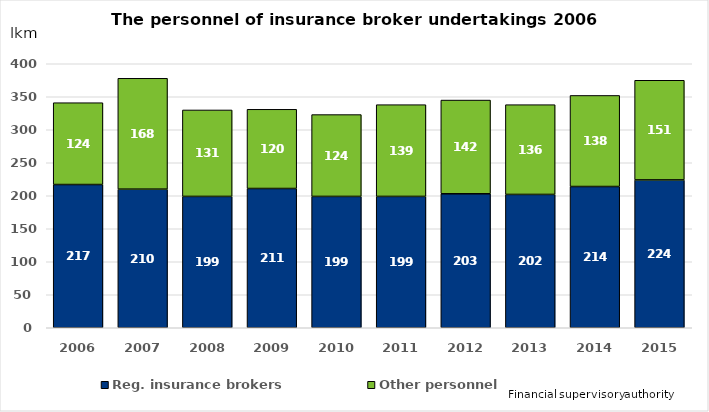
| Category | Reg. insurance brokers | Other personnel |
|---|---|---|
| 2006.0 | 217 | 124 |
| 2007.0 | 210 | 168 |
| 2008.0 | 199 | 131 |
| 2009.0 | 211 | 120 |
| 2010.0 | 199 | 124 |
| 2011.0 | 199 | 139 |
| 2012.0 | 203 | 142 |
| 2013.0 | 202 | 136 |
| 2014.0 | 214 | 138 |
| 2015.0 | 224 | 151 |